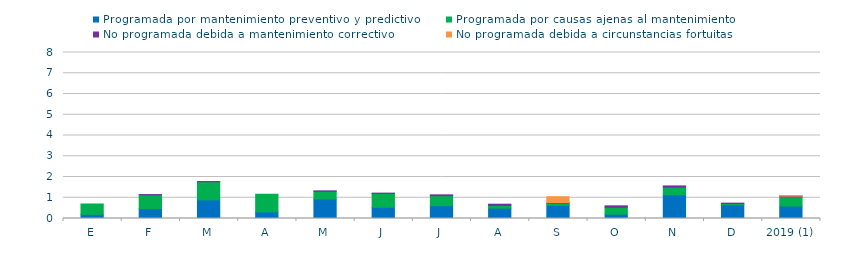
| Category | Programada por mantenimiento preventivo y predictivo | Programada por causas ajenas al mantenimiento  | No programada debida a mantenimiento correctivo  | No programada debida a circunstancias fortuitas  |
|---|---|---|---|---|
| E | 0.2 | 0.5 | 0 | 0 |
| F | 0.48 | 0.66 | 0.01 | 0 |
| M | 0.9 | 0.87 | 0.01 | 0 |
| A | 0.32 | 0.85 | 0 | 0 |
| M | 0.94 | 0.37 | 0.02 | 0 |
| J | 0.54 | 0.67 | 0.01 | 0 |
| J | 0.62 | 0.48 | 0.04 | 0 |
| A | 0.5 | 0.13 | 0.06 | 0 |
| S | 0.63 | 0.12 | 0.02 | 0.28 |
| O | 0.21 | 0.33 | 0.07 | 0 |
| N | 1.14 | 0.37 | 0.06 | 0 |
| D | 0.66 | 0.06 | 0.02 | 0 |
| 2019 (1) | 0.6 | 0.45 | 0.03 | 0.02 |